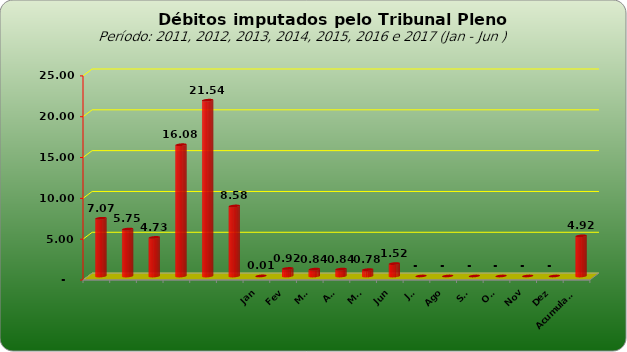
| Category |  7.073.154,74  |
|---|---|
|  | 7073154.74 |
|  | 5749129.25 |
|  | 4727033.51 |
|  | 16081820.48 |
|  | 21535723.6 |
|  | 8578266.09 |
| Jan | 7518 |
| Fev | 924330.96 |
| Mar | 840781.7 |
| Abr | 842058.28 |
| Mai | 780852.82 |
| Jun | 1521029.64 |
| Jul | 0 |
| Ago | 0 |
| Set | 0 |
| Out | 0 |
| Nov | 0 |
| Dez | 0 |
| Acumulado | 4916571.4 |